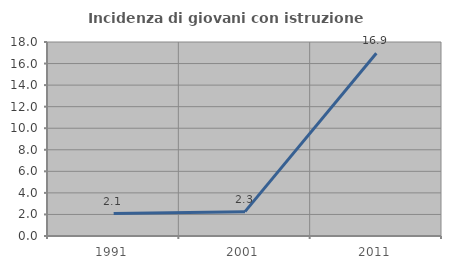
| Category | Incidenza di giovani con istruzione universitaria |
|---|---|
| 1991.0 | 2.083 |
| 2001.0 | 2.26 |
| 2011.0 | 16.949 |